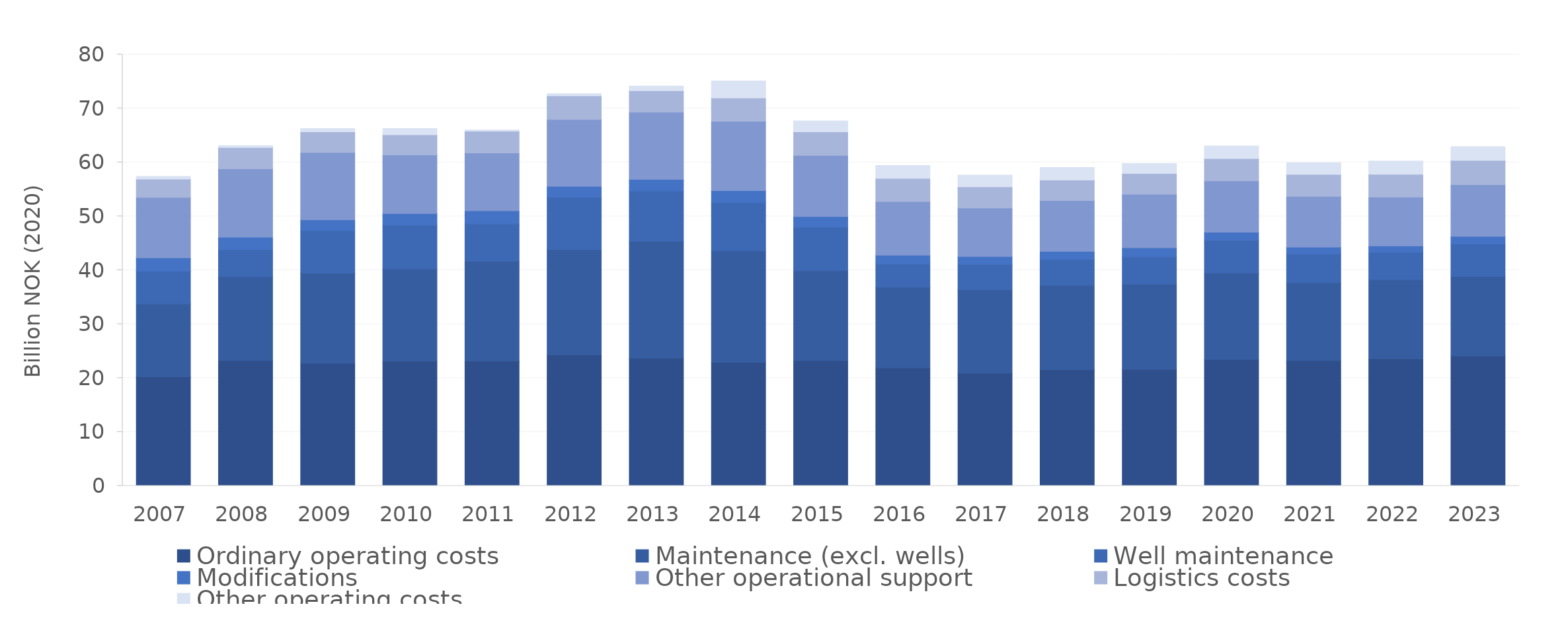
| Category | Ordinary operating costs | Maintenance (excl. wells) | Well maintenance | Modifications  | Other operational support  | Logistics costs | Other operating costs |
|---|---|---|---|---|---|---|---|
| 2007.0 | 20.259 | 13.507 | 6.053 | 2.464 | 11.239 | 3.387 | 0.5 |
| 2008.0 | 23.249 | 15.565 | 5.003 | 2.295 | 12.694 | 3.961 | 0.337 |
| 2009.0 | 22.768 | 16.671 | 7.873 | 2.026 | 12.511 | 3.802 | 0.629 |
| 2010.0 | 23.113 | 17.127 | 8.083 | 2.182 | 10.865 | 3.757 | 1.16 |
| 2011.0 | 23.151 | 18.504 | 6.919 | 2.443 | 10.728 | 4.058 | 0.203 |
| 2012.0 | 24.329 | 19.488 | 9.707 | 2.023 | 12.426 | 4.361 | 0.394 |
| 2013.0 | 23.666 | 21.69 | 9.315 | 2.189 | 12.461 | 3.977 | 0.844 |
| 2014.0 | 22.909 | 20.662 | 8.916 | 2.288 | 12.853 | 4.31 | 3.147 |
| 2015.0 | 23.24 | 16.661 | 8.048 | 2.005 | 11.343 | 4.362 | 2.042 |
| 2016.0 | 21.883 | 14.955 | 4.327 | 1.621 | 9.952 | 4.286 | 2.401 |
| 2017.0 | 20.922 | 15.47 | 4.694 | 1.455 | 8.995 | 3.942 | 2.164 |
| 2018.0 | 21.553 | 15.657 | 4.794 | 1.502 | 9.404 | 3.828 | 2.317 |
| 2019.0 | 21.59 | 15.83 | 5.039 | 1.709 | 9.925 | 3.853 | 1.834 |
| 2020.0 | 23.443 | 16.04 | 6.047 | 1.502 | 9.545 | 4.139 | 2.327 |
| 2021.0 | 23.248 | 14.459 | 5.298 | 1.297 | 9.403 | 4.057 | 2.184 |
| 2022.0 | 23.596 | 14.656 | 5.066 | 1.182 | 9.083 | 4.209 | 2.461 |
| 2023.0 | 24.118 | 14.708 | 6.015 | 1.436 | 9.599 | 4.5 | 2.527 |